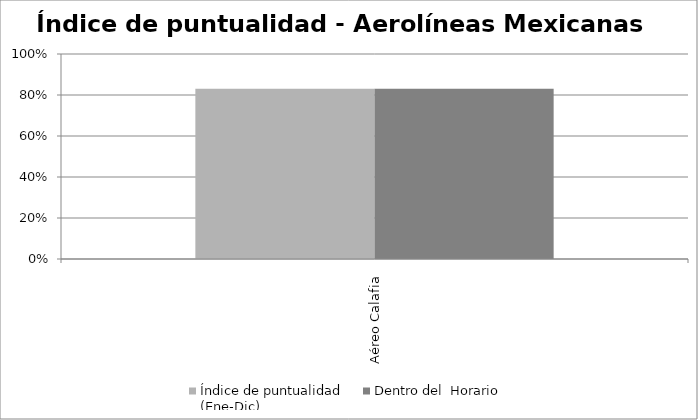
| Category | Índice de puntualidad
(Ene-Dic) | Dentro del  Horario |
|---|---|---|
| Aéreo Calafia | 0.83 | 0.83 |